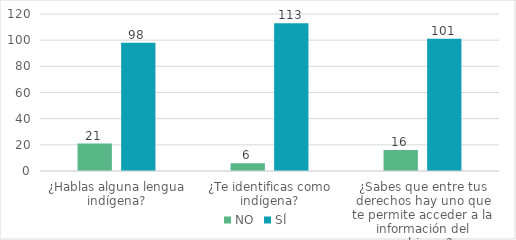
| Category | NO | SÍ |
|---|---|---|
| ¿Hablas alguna lengua indígena? | 21 | 98 |
| ¿Te identificas como indígena? | 6 | 113 |
| ¿Sabes que entre tus derechos hay uno que te permite acceder a la información del gobierno? | 16 | 101 |